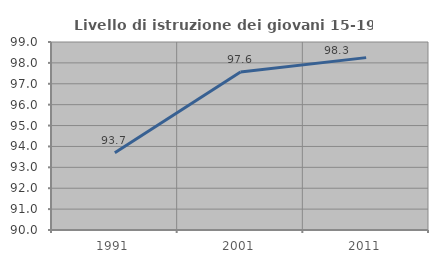
| Category | Livello di istruzione dei giovani 15-19 anni |
|---|---|
| 1991.0 | 93.703 |
| 2001.0 | 97.561 |
| 2011.0 | 98.252 |